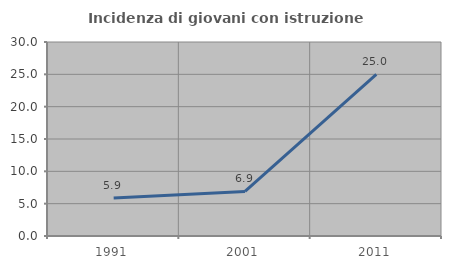
| Category | Incidenza di giovani con istruzione universitaria |
|---|---|
| 1991.0 | 5.882 |
| 2001.0 | 6.897 |
| 2011.0 | 25 |